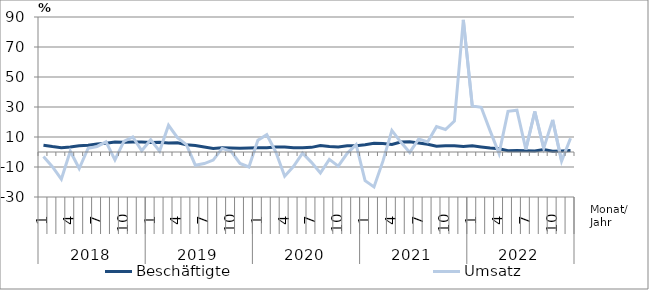
| Category | Beschäftigte | Umsatz |
|---|---|---|
| 0 | 4.5 | -3 |
| 1 | 3.6 | -9.8 |
| 2 | 2.9 | -18.1 |
| 3 | 3.4 | 0.5 |
| 4 | 4.2 | -11 |
| 5 | 4.5 | 2.5 |
| 6 | 5.3 | 3.7 |
| 7 | 5.8 | 6.8 |
| 8 | 6.6 | -5.2 |
| 9 | 6.5 | 7.1 |
| 10 | 6.6 | 10.1 |
| 11 | 6.6 | 0.8 |
| 12 | 6.4 | 8.2 |
| 13 | 6.5 | 0.6 |
| 14 | 6 | 17.8 |
| 15 | 6.1 | 9.6 |
| 16 | 4.9 | 4.9 |
| 17 | 4.3 | -8.8 |
| 18 | 3.3 | -7.7 |
| 19 | 2.4 | -5.4 |
| 20 | 2.8 | 2.4 |
| 21 | 2.7 | 0.5 |
| 22 | 2.5 | -7.6 |
| 23 | 2.7 | -10 |
| 24 | 2.9 | 7.8 |
| 25 | 2.9 | 11.5 |
| 26 | 3.4 | 0.1 |
| 27 | 3.4 | -16.1 |
| 28 | 2.9 | -9.5 |
| 29 | 2.9 | -0.8 |
| 30 | 3.1 | -6.9 |
| 31 | 4.3 | -14 |
| 32 | 3.6 | -4.9 |
| 33 | 3.4 | -9.4 |
| 34 | 4.1 | -0.9 |
| 35 | 4.1 | 4.9 |
| 36 | 4.8 | -19.1 |
| 37 | 5.8 | -23.3 |
| 38 | 5.6 | -6.1 |
| 39 | 5 | 14.4 |
| 40 | 6.6 | 6.6 |
| 41 | 6.9 | -0.3 |
| 42 | 6 | 8.7 |
| 43 | 5.2 | 6.7 |
| 44 | 3.8 | 16.9 |
| 45 | 4.2 | 15 |
| 46 | 4.2 | 20.6 |
| 47 | 3.7 | 88.1 |
| 48 | 4.1 | 30.7 |
| 49 | 3.4 | 29.8 |
| 50 | 2.6 | 14.1 |
| 51 | 2.1 | -1.1 |
| 52 | 0.9 | 27.1 |
| 53 | 1 | 27.9 |
| 54 | 0.8 | 1.7 |
| 55 | 0.7 | 27 |
| 56 | 1.6 | 2.6 |
| 57 | 0.5 | 21.4 |
| 58 | 0.7 | -6.1 |
| 59 | 1 | 9.2 |